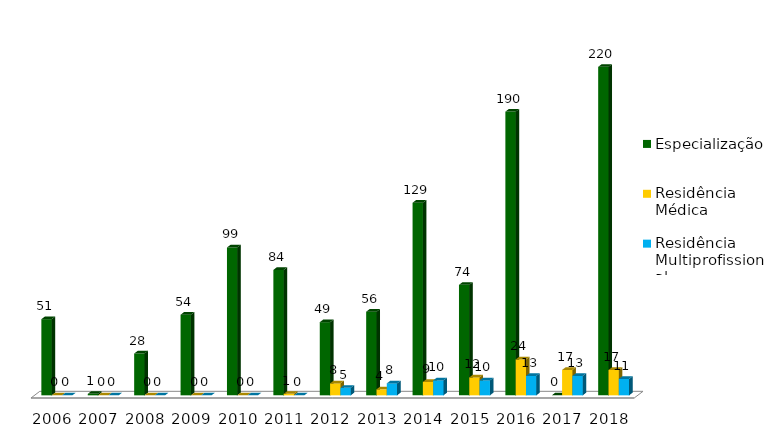
| Category | Especialização | Residência Médica | Residência Multiprofissional |
|---|---|---|---|
| 2006.0 | 51 | 0 | 0 |
| 2007.0 | 1 | 0 | 0 |
| 2008.0 | 28 | 0 | 0 |
| 2009.0 | 54 | 0 | 0 |
| 2010.0 | 99 | 0 | 0 |
| 2011.0 | 84 | 1 | 0 |
| 2012.0 | 49 | 8 | 5 |
| 2013.0 | 56 | 4 | 8 |
| 2014.0 | 129 | 9 | 10 |
| 2015.0 | 74 | 12 | 10 |
| 2016.0 | 190 | 24 | 13 |
| 2017.0 | 0 | 17 | 13 |
| 2018.0 | 220 | 17 | 11 |